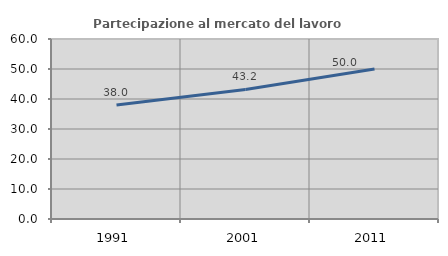
| Category | Partecipazione al mercato del lavoro  femminile |
|---|---|
| 1991.0 | 37.963 |
| 2001.0 | 43.172 |
| 2011.0 | 50 |